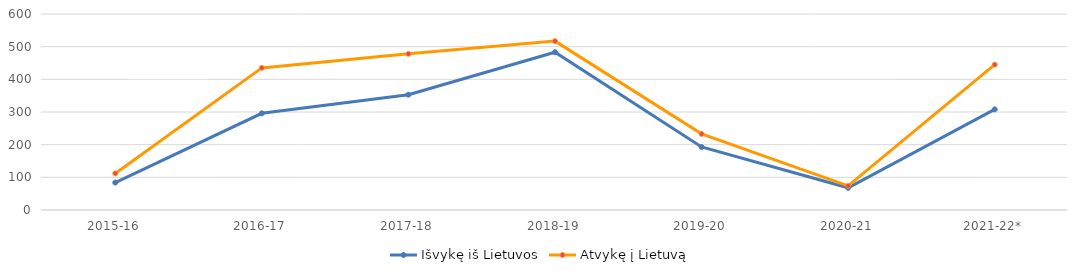
| Category | Išvykę iš Lietuvos | Atvykę į Lietuvą |
|---|---|---|
| 2015-16 | 84 | 112 |
| 2016-17 | 296 | 435 |
| 2017-18 | 353 | 478 |
| 2018-19 | 483 | 517 |
| 2019-20 | 193 | 233 |
| 2020-21 | 68 | 74 |
| 2021-22* | 308 | 445 |